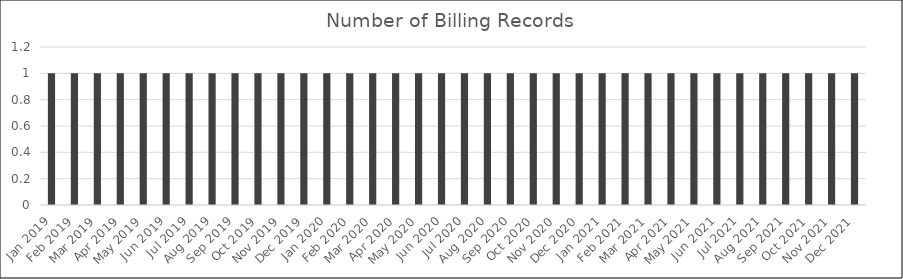
| Category | Num Records |
|---|---|
| Jan 2019 | 1 |
| Feb 2019 | 1 |
| Mar 2019 | 1 |
| Apr 2019 | 1 |
| May 2019 | 1 |
| Jun 2019 | 1 |
| Jul 2019 | 1 |
| Aug 2019 | 1 |
| Sep 2019 | 1 |
| Oct 2019 | 1 |
| Nov 2019 | 1 |
| Dec 2019 | 1 |
| Jan 2020 | 1 |
| Feb 2020 | 1 |
| Mar 2020 | 1 |
| Apr 2020 | 1 |
| May 2020 | 1 |
| Jun 2020 | 1 |
| Jul 2020 | 1 |
| Aug 2020 | 1 |
| Sep 2020 | 1 |
| Oct 2020 | 1 |
| Nov 2020 | 1 |
| Dec 2020 | 1 |
| Jan 2021 | 1 |
| Feb 2021 | 1 |
| Mar 2021 | 1 |
| Apr 2021 | 1 |
| May 2021 | 1 |
| Jun 2021 | 1 |
| Jul 2021 | 1 |
| Aug 2021 | 1 |
| Sep 2021 | 1 |
| Oct 2021 | 1 |
| Nov 2021 | 1 |
| Dec 2021 | 1 |